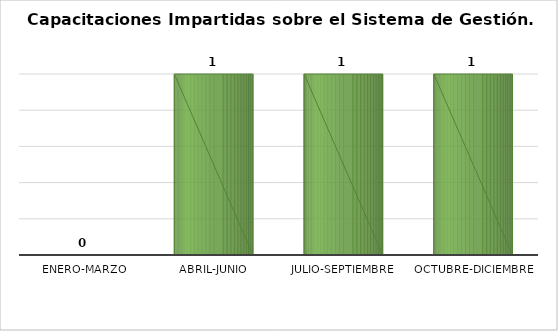
| Category | Capacitaciones impartidas/1 |
|---|---|
| Enero-Marzo | 0 |
| Abril-Junio | 1 |
| Julio-Septiembre | 1 |
| Octubre-Diciembre | 1 |